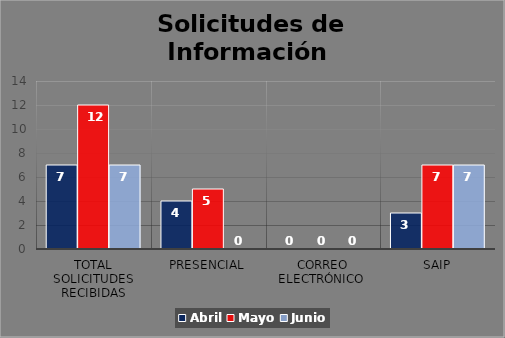
| Category | Abril | Mayo | Junio |
|---|---|---|---|
| Total Solicitudes Recibidas | 7 | 12 | 7 |
| Presencial | 4 | 5 | 0 |
| Correo Electrónico  | 0 | 0 | 0 |
| SAIP | 3 | 7 | 7 |